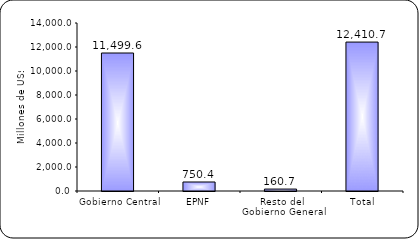
| Category | Series 1 |
|---|---|
| Gobierno Central | 11499.6 |
| EPNF | 750.4 |
| Resto del Gobierno General | 160.7 |
| Total | 12410.7 |